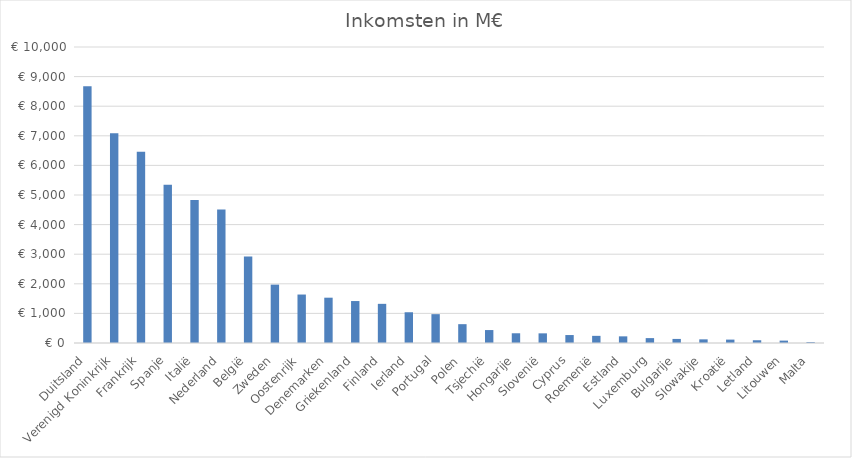
| Category | Inkomsten in M€ |
|---|---|
| Duitsland | 8670.087 |
| Verenigd Koninkrijk | 7082.16 |
| Frankrijk | 6458.514 |
| Spanje | 5347.424 |
| Italië | 4832.409 |
| Nederland | 4505.926 |
| België | 2918.892 |
| Zweden | 1971.742 |
| Oostenrijk | 1637.414 |
| Denemarken | 1530.83 |
| Griekenland | 1417.453 |
| Finland | 1322.969 |
| Ierland | 1038.725 |
| Portugal | 974.475 |
| Polen | 636.224 |
| Tsjechië | 437.212 |
| Hongarije | 328.69 |
| Slovenië | 326.229 |
| Cyprus | 268.809 |
| Roemenië | 241.521 |
| Estland | 224.707 |
| Luxemburg | 165.129 |
| Bulgarije | 137.559 |
| Slowakije | 123.466 |
| Kroatië | 114.662 |
| Letland | 92.681 |
| Litouwen | 80.678 |
| Malta | 30.997 |